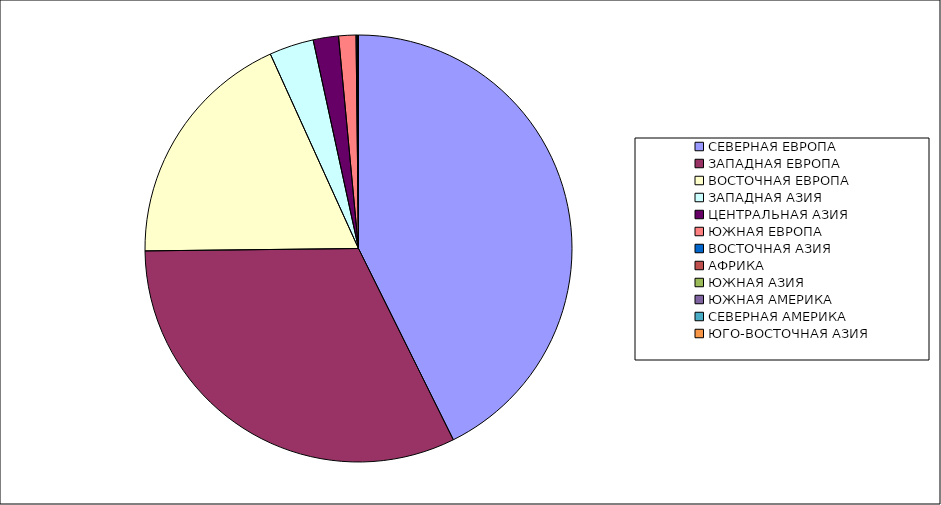
| Category | Оборот |
|---|---|
| СЕВЕРНАЯ ЕВРОПА | 42.673 |
| ЗАПАДНАЯ ЕВРОПА | 32.147 |
| ВОСТОЧНАЯ ЕВРОПА | 18.405 |
| ЗАПАДНАЯ АЗИЯ | 3.367 |
| ЦЕНТРАЛЬНАЯ АЗИЯ | 1.916 |
| ЮЖНАЯ ЕВРОПА | 1.309 |
| ВОСТОЧНАЯ АЗИЯ | 0.089 |
| АФРИКА | 0.066 |
| ЮЖНАЯ АЗИЯ | 0.02 |
| ЮЖНАЯ АМЕРИКА | 0.004 |
| СЕВЕРНАЯ АМЕРИКА | 0.004 |
| ЮГО-ВОСТОЧНАЯ АЗИЯ | 0.001 |